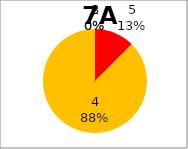
| Category | Series 0 |
|---|---|
| 5.0 | 1 |
| 4.0 | 7 |
| 3.0 | 0 |
| 2.0 | 0 |